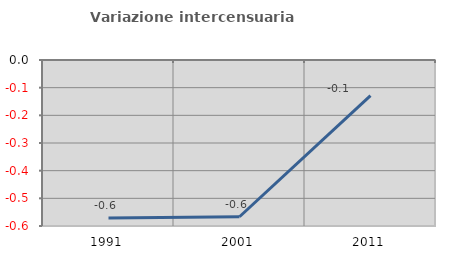
| Category | Variazione intercensuaria annua |
|---|---|
| 1991.0 | -0.571 |
| 2001.0 | -0.567 |
| 2011.0 | -0.129 |